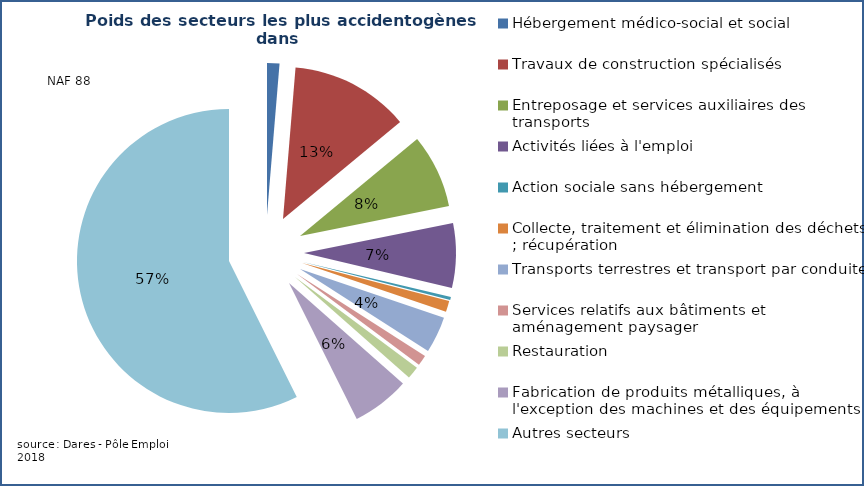
| Category | Autres secteurs |
|---|---|
| Hébergement médico-social et social | 0.013 |
| Travaux de construction spécialisés | 0.127 |
| Entreposage et services auxiliaires des transports | 0.078 |
| Activités liées à l'emploi | 0.069 |
| Action sociale sans hébergement | 0.003 |
| Collecte, traitement et élimination des déchets ; récupération | 0.012 |
| Transports terrestres et transport par conduites | 0.039 |
| Services relatifs aux bâtiments et aménagement paysager | 0.011 |
| Restauration | 0.013 |
| Fabrication de produits métalliques, à l'exception des machines et des équipements | 0.061 |
| Autres secteurs | 0.574 |